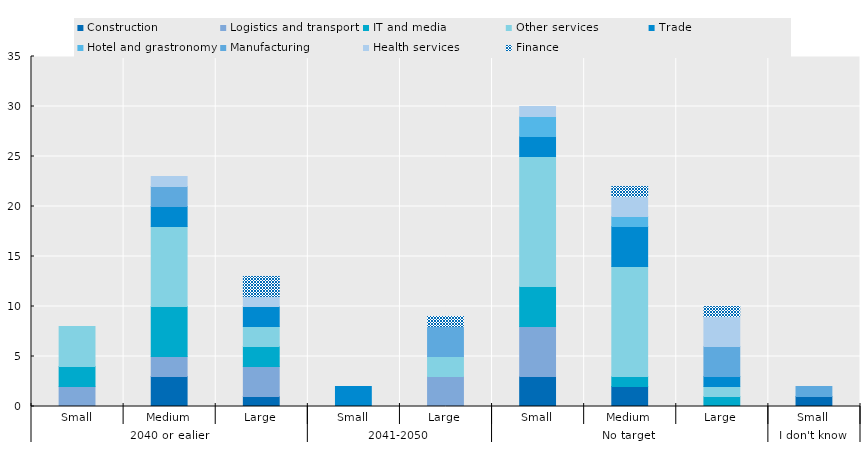
| Category | Construction | Logistics and transport | IT and media | Other services | Trade | Hotel and grastronomy | Manufacturing | Health services | Finance |
|---|---|---|---|---|---|---|---|---|---|
| 0 | 0 | 2 | 2 | 4 | 0 | 0 | 0 | 0 | 0 |
| 1 | 3 | 2 | 5 | 8 | 2 | 0 | 2 | 1 | 0 |
| 2 | 1 | 3 | 2 | 2 | 2 | 0 | 0 | 1 | 2 |
| 3 | 0 | 0 | 0 | 0 | 2 | 0 | 0 | 0 | 0 |
| 4 | 0 | 3 | 0 | 2 | 0 | 0 | 3 | 0 | 1 |
| 5 | 3 | 5 | 4 | 13 | 2 | 2 | 0 | 1 | 0 |
| 6 | 2 | 0 | 1 | 11 | 4 | 1 | 0 | 2 | 1 |
| 7 | 0 | 0 | 1 | 1 | 1 | 0 | 3 | 3 | 1 |
| 8 | 1 | 0 | 0 | 0 | 0 | 0 | 1 | 0 | 0 |